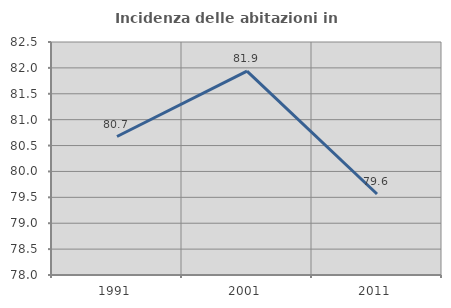
| Category | Incidenza delle abitazioni in proprietà  |
|---|---|
| 1991.0 | 80.675 |
| 2001.0 | 81.938 |
| 2011.0 | 79.565 |